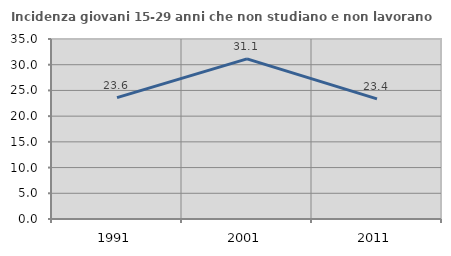
| Category | Incidenza giovani 15-29 anni che non studiano e non lavorano  |
|---|---|
| 1991.0 | 23.59 |
| 2001.0 | 31.141 |
| 2011.0 | 23.355 |